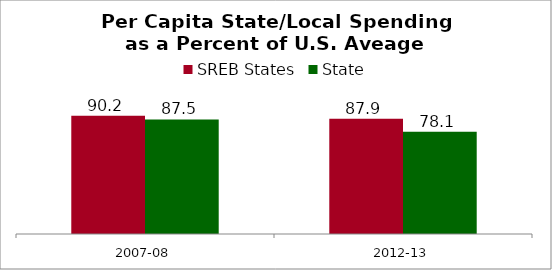
| Category | SREB States | State |
|---|---|---|
| 2007-08 | 90.181 | 87.463 |
| 2012-13 | 87.948 | 78.141 |